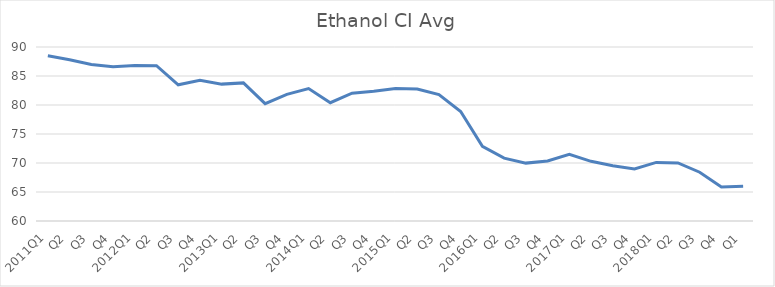
| Category | Series 0 |
|---|---|
| 2011Q1 | 88.48 |
| Q2 | 87.8 |
| Q3 | 87 |
| Q4 | 86.6 |
| 2012Q1 | 86.8 |
| Q2 | 86.78 |
| Q3 | 83.48 |
| Q4 | 84.27 |
| 2013Q1 | 83.6 |
| Q2 | 83.81 |
| Q3 | 80.24 |
| Q4 | 81.84 |
| 2014Q1 | 82.83 |
| Q2 | 80.4 |
| Q3 | 82.03 |
| Q4 | 82.38 |
| 2015Q1 | 82.86 |
| Q2 | 82.75 |
| Q3 | 81.8 |
| Q4 | 78.87 |
| 2016Q1 | 72.87 |
| Q2 | 70.83 |
| Q3 | 69.98 |
| Q4 | 70.34 |
| 2017Q1 | 71.49 |
| Q2 | 70.29 |
| Q3 | 69.51 |
| Q4 | 68.98 |
| 2018Q1 | 70.1 |
| Q2 | 70.02 |
| Q3 | 68.41 |
| Q4 | 65.88 |
| Q1 | 65.99 |